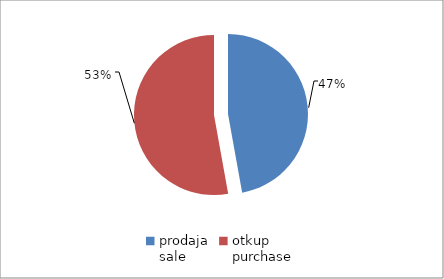
| Category | Series 0 |
|---|---|
| prodaja
sale | 52978440.61 |
| otkup
purchase | 59352975.59 |